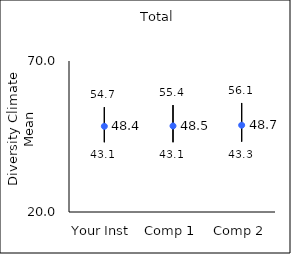
| Category | 25th percentile | 75th percentile | Mean |
|---|---|---|---|
| Your Inst | 43.1 | 54.7 | 48.38 |
| Comp 1 | 43.1 | 55.4 | 48.49 |
| Comp 2 | 43.3 | 56.1 | 48.74 |